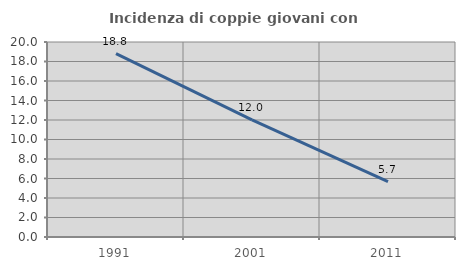
| Category | Incidenza di coppie giovani con figli |
|---|---|
| 1991.0 | 18.81 |
| 2001.0 | 12.018 |
| 2011.0 | 5.677 |